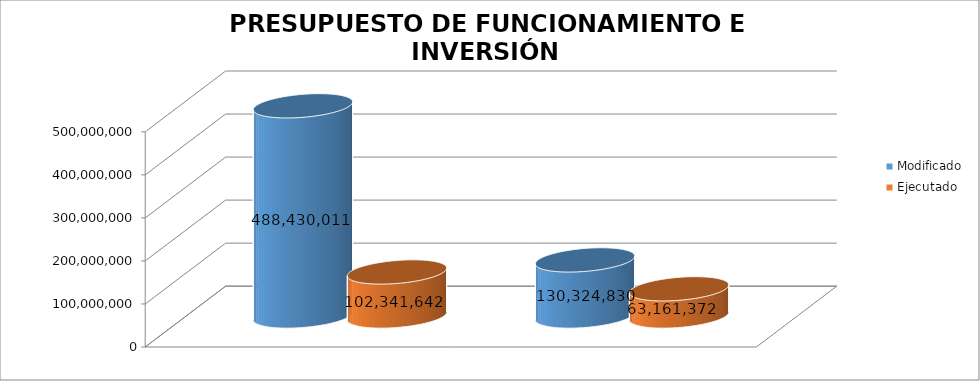
| Category | Modificado | Ejecutado | Series 2 |
|---|---|---|---|
| 0 | 130324830 | 63161371.75 |  |